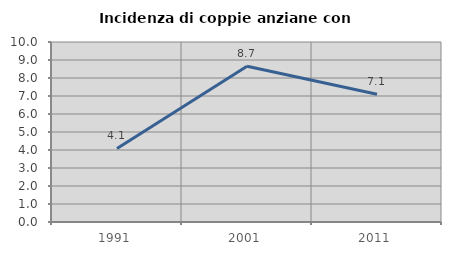
| Category | Incidenza di coppie anziane con figli |
|---|---|
| 1991.0 | 4.086 |
| 2001.0 | 8.654 |
| 2011.0 | 7.102 |